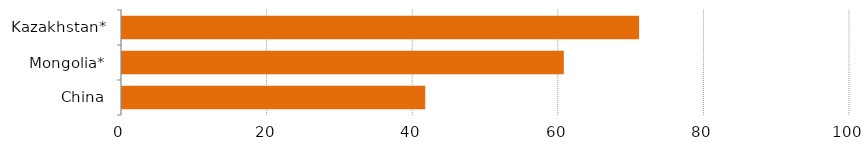
| Category | Series 0 |
|---|---|
| China | 41.65 |
| Mongolia* | 60.69 |
| Kazakhstan* | 71.03 |